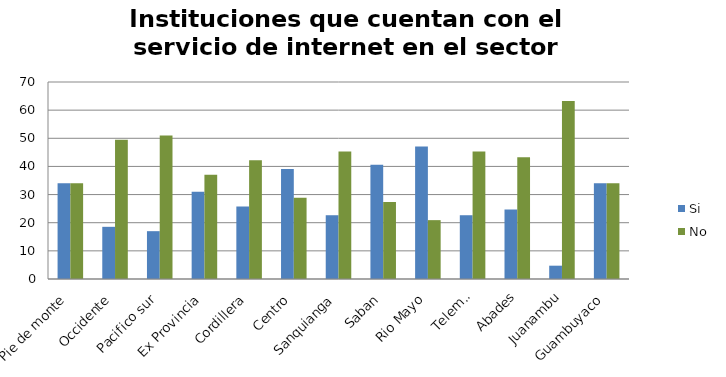
| Category | Si | No |
|---|---|---|
| Pie de monte | 33.99 | 33.99 |
| Occidente | 18.54 | 49.44 |
| Pacifico sur | 16.995 | 50.985 |
| Ex Provincia | 30.963 | 37.017 |
| Cordillera | 25.805 | 42.175 |
| Centro | 39.087 | 28.893 |
| Sanquianga | 22.66 | 45.32 |
| Saban | 40.597 | 27.383 |
| Rio Mayo | 47.063 | 20.917 |
| Telembi | 22.66 | 45.32 |
| Abades | 24.72 | 43.26 |
| Juanambu | 4.73 | 63.25 |
| Guambuyaco | 33.99 | 33.99 |